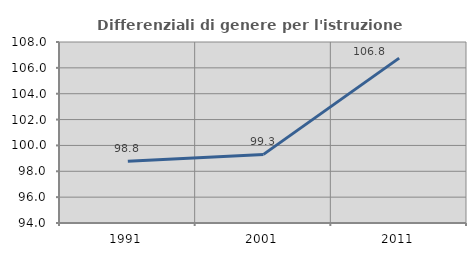
| Category | Differenziali di genere per l'istruzione superiore |
|---|---|
| 1991.0 | 98.776 |
| 2001.0 | 99.306 |
| 2011.0 | 106.752 |